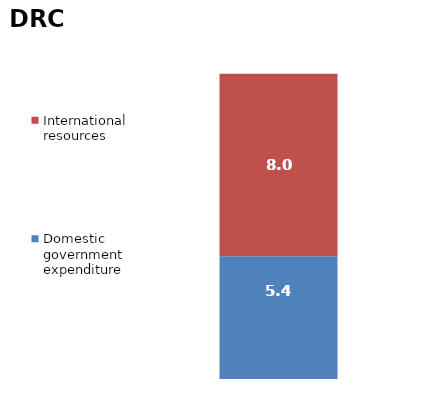
| Category | Domestic government expenditure | International resources |
|---|---|---|
| 0 | 5.376 | 8.005 |